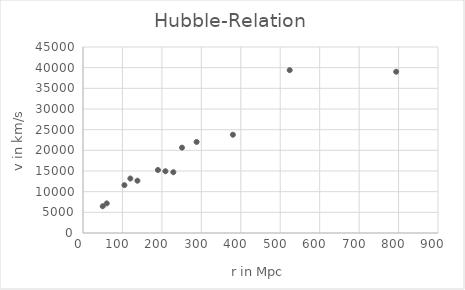
| Category | v in km/s |
|---|---|
| 209.0 | 14936.655 |
| 229.0 | 14708.033 |
| 190.0 | 15241.484 |
| 524.0 | 39399.237 |
| 794.0 | 39018.2 |
| 380.0 | 23776.716 |
| 251.0 | 20652.211 |
| 288.0 | 22023.945 |
| 60.2 | 7163.498 |
| 50.0 | 6477.631 |
| 105.0 | 11583.528 |
| 138.0 | 12650.432 |
| 120.0 | 13183.884 |